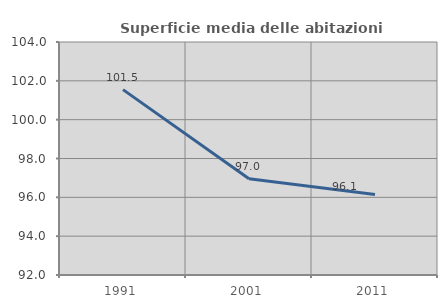
| Category | Superficie media delle abitazioni occupate |
|---|---|
| 1991.0 | 101.546 |
| 2001.0 | 96.957 |
| 2011.0 | 96.147 |